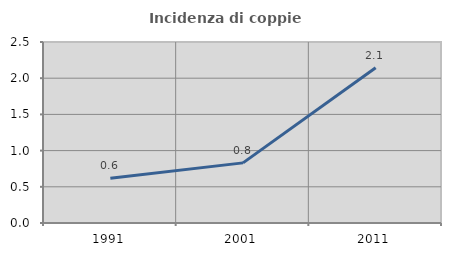
| Category | Incidenza di coppie miste |
|---|---|
| 1991.0 | 0.619 |
| 2001.0 | 0.83 |
| 2011.0 | 2.144 |